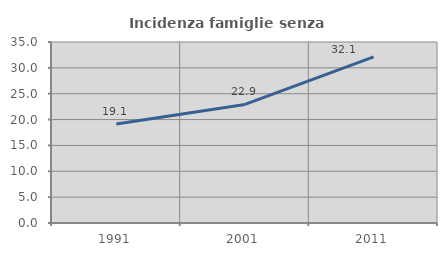
| Category | Incidenza famiglie senza nuclei |
|---|---|
| 1991.0 | 19.145 |
| 2001.0 | 22.929 |
| 2011.0 | 32.122 |